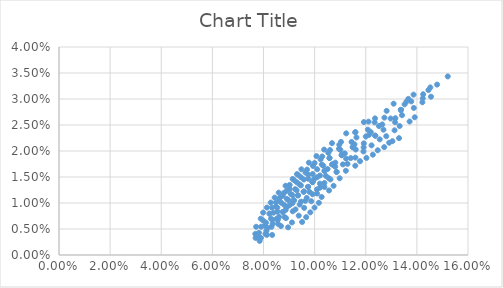
| Category | Series 0 |
|---|---|
| 0.07849210297705407 | 0.003 |
| 0.0811743257709537 | 0.005 |
| 0.08559861464190656 | 0.007 |
| 0.08865699809654287 | 0.009 |
| 0.0918520796829344 | 0.011 |
| 0.09573665319920564 | 0.012 |
| 0.09916619754605611 | 0.014 |
| 0.10387649270633424 | 0.016 |
| 0.10808851076847913 | 0.018 |
| 0.1118035528330265 | 0.02 |
| 0.11558868214379826 | 0.021 |
| 0.12127132130758715 | 0.023 |
| 0.1251883458378177 | 0.025 |
| 0.12973217934383538 | 0.026 |
| 0.13374420981332527 | 0.028 |
| 0.13779836612817092 | 0.03 |
| 0.14246406537783846 | 0.031 |
| 0.14791270222244338 | 0.033 |
| 0.15207736131235677 | 0.034 |
| 0.0833814307801798 | 0.004 |
| 0.08683115969566685 | 0.006 |
| 0.08880676271872487 | 0.007 |
| 0.09252270961221412 | 0.009 |
| 0.09467047227318069 | 0.01 |
| 0.09802187939158186 | 0.012 |
| 0.10206178969027282 | 0.014 |
| 0.10442470539097172 | 0.015 |
| 0.10804075292779088 | 0.017 |
| 0.11231933829241132 | 0.019 |
| 0.11608447652906288 | 0.02 |
| 0.11924286329137909 | 0.021 |
| 0.1237006269620872 | 0.023 |
| 0.12693277459077076 | 0.024 |
| 0.13148073296946738 | 0.026 |
| 0.13418809053347397 | 0.027 |
| 0.13881037753769906 | 0.028 |
| 0.1421556177082096 | 0.029 |
| 0.14552048095315892 | 0.03 |
| 0.08961711038147725 | 0.005 |
| 0.09114011177796506 | 0.006 |
| 0.09378573611604699 | 0.008 |
| 0.09590673387094169 | 0.009 |
| 0.09868984598151245 | 0.01 |
| 0.10093678670850117 | 0.012 |
| 0.10383717438005824 | 0.013 |
| 0.10619284299159418 | 0.015 |
| 0.10859855041904543 | 0.016 |
| 0.11286548480720748 | 0.018 |
| 0.11596493645428099 | 0.019 |
| 0.1191016679560657 | 0.02 |
| 0.12227281026450827 | 0.021 |
| 0.12547575441907483 | 0.022 |
| 0.1280261589043001 | 0.023 |
| 0.13127682578834932 | 0.024 |
| 0.13325904506316058 | 0.025 |
| 0.13715070052754968 | 0.026 |
| 0.1391586222896598 | 0.026 |
| 0.09510931711654969 | 0.006 |
| 0.09670132659841102 | 0.007 |
| 0.09832324809696294 | 0.008 |
| 0.09997362579055317 | 0.009 |
| 0.10165107366875394 | 0.01 |
| 0.10274384304672825 | 0.011 |
| 0.10564920168064439 | 0.012 |
| 0.10741169900584152 | 0.013 |
| 0.10979202662454098 | 0.015 |
| 0.11221973653686829 | 0.016 |
| 0.1159002454778847 | 0.017 |
| 0.11776940820301726 | 0.018 |
| 0.12026264207487335 | 0.019 |
| 0.12277283353342405 | 0.019 |
| 0.12468709261671139 | 0.02 |
| 0.12722627658530808 | 0.021 |
| 0.12916722053590737 | 0.022 |
| 0.13044814280565367 | 0.022 |
| 0.13301976983096028 | 0.022 |
| 0.07822905865678728 | 0.004 |
| 0.08097957270178449 | 0.006 |
| 0.08236788085575084 | 0.008 |
| 0.084889873784626 | 0.009 |
| 0.08591629263298864 | 0.01 |
| 0.08750258803188682 | 0.011 |
| 0.08912208857341217 | 0.012 |
| 0.09024580869491589 | 0.013 |
| 0.09192501018924845 | 0.014 |
| 0.09363257550935863 | 0.015 |
| 0.09704292489098112 | 0.016 |
| 0.0999808555089506 | 0.018 |
| 0.10297138273422739 | 0.019 |
| 0.1060100554338495 | 0.02 |
| 0.1103126754157474 | 0.022 |
| 0.11592994606834588 | 0.024 |
| 0.12108860662438246 | 0.026 |
| 0.12816872656147238 | 0.028 |
| 0.13870159746175426 | 0.031 |
| 0.08160285703052578 | 0.005 |
| 0.08348862843864494 | 0.007 |
| 0.08546133636133703 | 0.008 |
| 0.08805931034306258 | 0.01 |
| 0.08965325537013248 | 0.011 |
| 0.09127935388551334 | 0.012 |
| 0.09293591813706709 | 0.012 |
| 0.0946213480200461 | 0.013 |
| 0.09747758711142347 | 0.015 |
| 0.09922898461902414 | 0.016 |
| 0.10336109981956515 | 0.017 |
| 0.10581765924118058 | 0.019 |
| 0.11009598525346843 | 0.02 |
| 0.11444827102217514 | 0.022 |
| 0.12081331408204345 | 0.024 |
| 0.12730151203727216 | 0.026 |
| 0.13519327501638426 | 0.029 |
| 0.1452691534604774 | 0.032 |
| 0.0788787536411368 | 0.003 |
| 0.08312837440972774 | 0.005 |
| 0.085045745859657 | 0.007 |
| 0.08760035880392981 | 0.008 |
| 0.09023834458433486 | 0.01 |
| 0.0918520796829344 | 0.011 |
| 0.09349652634064731 | 0.011 |
| 0.09573665319920564 | 0.012 |
| 0.09743841982144451 | 0.013 |
| 0.09916619754605611 | 0.014 |
| 0.10091865041267142 | 0.015 |
| 0.10387649270633424 | 0.016 |
| 0.10688390650521354 | 0.017 |
| 0.11058067157896682 | 0.019 |
| 0.11492392590011687 | 0.021 |
| 0.12001186464518468 | 0.023 |
| 0.12646402436956816 | 0.025 |
| 0.13374420981332527 | 0.028 |
| 0.14452271871474948 | 0.032 |
| 0.08130091331750335 | 0.004 |
| 0.08569504999576223 | 0.006 |
| 0.08823589304508511 | 0.007 |
| 0.09143581655516232 | 0.008 |
| 0.09414068191080142 | 0.01 |
| 0.09637320318831566 | 0.01 |
| 0.0969150113715317 | 0.011 |
| 0.09919242179984171 | 0.012 |
| 0.10090858400734913 | 0.013 |
| 0.10207140044719216 | 0.013 |
| 0.10382400090768831 | 0.014 |
| 0.10559936423405429 | 0.015 |
| 0.10859855041904543 | 0.016 |
| 0.11105104472573117 | 0.017 |
| 0.11413629455739308 | 0.019 |
| 0.11916560504409618 | 0.021 |
| 0.1237006269620872 | 0.023 |
| 0.13160072027135306 | 0.026 |
| 0.07680502588611007 | 0.004 |
| 0.07712202008027774 | 0.005 |
| 0.07893050702036414 | 0.007 |
| 0.07985721487562175 | 0.008 |
| 0.08132213667552692 | 0.009 |
| 0.08282726149151125 | 0.01 |
| 0.08437043774819197 | 0.011 |
| 0.08594961589436044 | 0.012 |
| 0.08863840954822756 | 0.013 |
| 0.09140180971448308 | 0.015 |
| 0.09310800124228577 | 0.016 |
| 0.09484123132115391 | 0.016 |
| 0.09775156014153447 | 0.018 |
| 0.10071726693416282 | 0.019 |
| 0.1037336020981766 | 0.02 |
| 0.1067962759033771 | 0.022 |
| 0.11235447893947857 | 0.023 |
| 0.11927553767714538 | 0.026 |
| 0.07692371617648976 | 0.003 |
| 0.07906357258786349 | 0.005 |
| 0.07994208478115028 | 0.007 |
| 0.08236788085575084 | 0.008 |
| 0.08334377057565001 | 0.009 |
| 0.08487538556536457 | 0.01 |
| 0.08644320819416787 | 0.011 |
| 0.0880453042351461 | 0.012 |
| 0.09020901699208869 | 0.013 |
| 0.09298775498995428 | 0.014 |
| 0.09469772711230665 | 0.015 |
| 0.09643415706755694 | 0.016 |
| 0.09935586374477952 | 0.017 |
| 0.10233142561600621 | 0.018 |
| 0.10535627970714036 | 0.02 |
| 0.10964283646901699 | 0.021 |
| 0.11592994606834588 | 0.024 |
| 0.1236217647769235 | 0.026 |
| 0.13665780284159268 | 0.03 |
| 0.07835052949181369 | 0.003 |
| 0.08053764183772225 | 0.006 |
| 0.08295137059884787 | 0.007 |
| 0.08390111750932219 | 0.008 |
| 0.08542058277651929 | 0.009 |
| 0.08697645998415611 | 0.01 |
| 0.08910732021690403 | 0.011 |
| 0.0907319466426301 | 0.012 |
| 0.09238727160065137 | 0.013 |
| 0.09407167455186603 | 0.014 |
| 0.09578362145534135 | 0.015 |
| 0.09752166175848469 | 0.015 |
| 0.10100422255979274 | 0.016 |
| 0.10280206587526339 | 0.017 |
| 0.10581765924118058 | 0.019 |
| 0.1095351281436742 | 0.02 |
| 0.11636623772916771 | 0.023 |
| 0.12347615059587995 | 0.025 |
| 0.13592363721581804 | 0.029 |
| 0.08075656278214269 | 0.004 |
| 0.08357497561920513 | 0.006 |
| 0.0860719114004363 | 0.007 |
| 0.08760035880392981 | 0.008 |
| 0.08916401729373899 | 0.009 |
| 0.09132275011106632 | 0.01 |
| 0.0918520796829344 | 0.011 |
| 0.09349652634064731 | 0.011 |
| 0.09573665319920564 | 0.012 |
| 0.09743841982144451 | 0.013 |
| 0.09916619754605611 | 0.014 |
| 0.09975498545523767 | 0.015 |
| 0.10208937202382763 | 0.015 |
| 0.10506491813011391 | 0.017 |
| 0.10688390650521354 | 0.017 |
| 0.11058067157896682 | 0.019 |
| 0.11492392590011687 | 0.021 |
| 0.12195724840558145 | 0.024 |
| 0.13374420981332527 | 0.028 |
| 0.0788787536411368 | 0.003 |
| 0.14230432998540704 | 0.03 |
| 0.13090858492261587 | 0.029 |